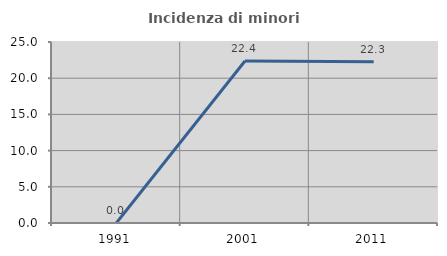
| Category | Incidenza di minori stranieri |
|---|---|
| 1991.0 | 0 |
| 2001.0 | 22.368 |
| 2011.0 | 22.255 |